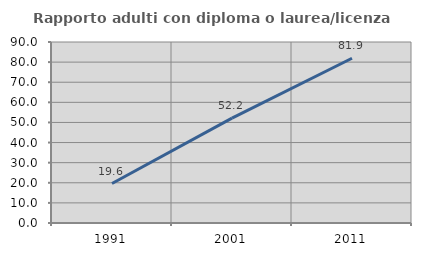
| Category | Rapporto adulti con diploma o laurea/licenza media  |
|---|---|
| 1991.0 | 19.626 |
| 2001.0 | 52.152 |
| 2011.0 | 81.915 |